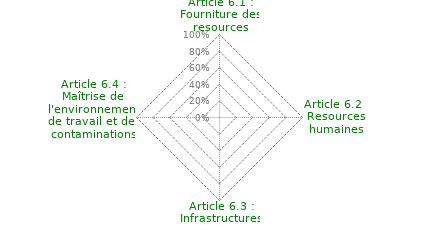
| Category | Article 6 : Management des ressources |
|---|---|
| Article 6.1 : Fourniture des resources | 0 |
| Article 6.2 : Resources humaines | 0 |
| Article 6.3 : Infrastructures | 0 |
| Article 6.4 : Maîtrise de l'environnement de travail et des contaminations | 0 |